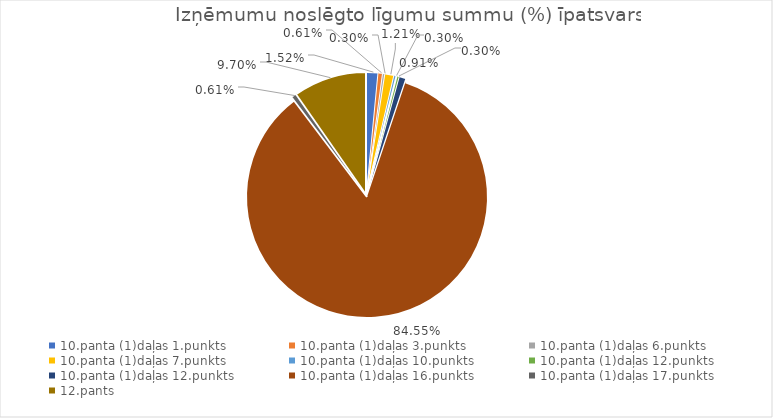
| Category | Īpatsvars (%) |
|---|---|
| 10.panta (1)daļas 1.punkts | 0.015 |
| 10.panta (1)daļas 3.punkts | 0.006 |
| 10.panta (1)daļas 6.punkts | 0.003 |
| 10.panta (1)daļas 7.punkts | 0.012 |
| 10.panta (1)daļas 10.punkts | 0.003 |
| 10.panta (1)daļas 12.punkts | 0.003 |
| 10.panta (1)daļas 12.punkts | 0.009 |
| 10.panta (1)daļas 16.punkts | 0.845 |
| 10.panta (1)daļas 17.punkts | 0.006 |
| 12.pants | 0.097 |